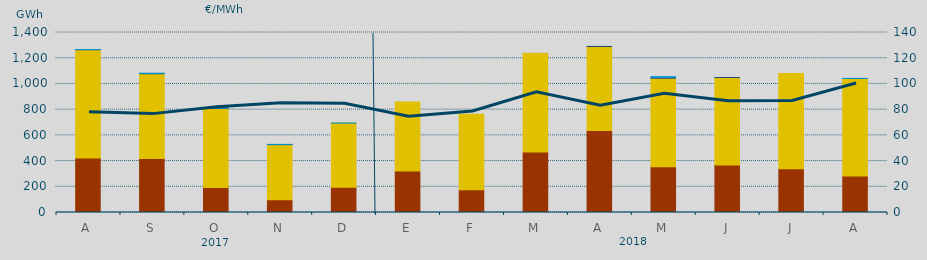
| Category | Carbón | Ciclo Combinado | Consumo Bombeo | Hidráulica | Otras Renovables |
|---|---|---|---|---|---|
| A | 424631 | 842008.2 | 227.4 | 714.3 | 0 |
| S | 419522.2 | 659557.1 | 2247.5 | 1903.2 | 0 |
| O | 195163.5 | 613794.4 | 2877.8 | 1865.1 | 0 |
| N | 99779.8 | 428275.6 | 370 | 1458.4 | 0 |
| D | 195559 | 499810.1 | 0 | 237.7 | 0 |
| E | 323414.2 | 535924.4 | 0 | 0 | 0 |
| F | 176086.6 | 587965.4 | 0 | 0 | 0 |
| M | 469679.3 | 766935.8 | 0 | 790 | 1096.8 |
| A | 637382 | 653437.2 | 1000 | 0 | 0 |
| M | 356322 | 688216.9 | 5321 | 6699 | 0 |
| J | 368722 | 680942.3 | 583.4 | 0 | 0 |
| J | 340015 | 740572.3 | 0 | 0 | 0 |
| A | 283796.9 | 758484.6 | 0 | 758.5 | 0 |